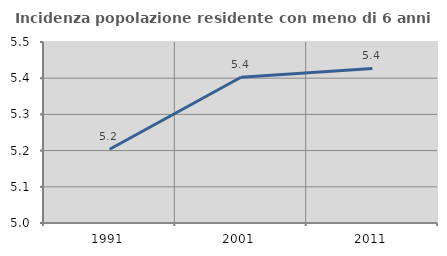
| Category | Incidenza popolazione residente con meno di 6 anni |
|---|---|
| 1991.0 | 5.204 |
| 2001.0 | 5.403 |
| 2011.0 | 5.427 |